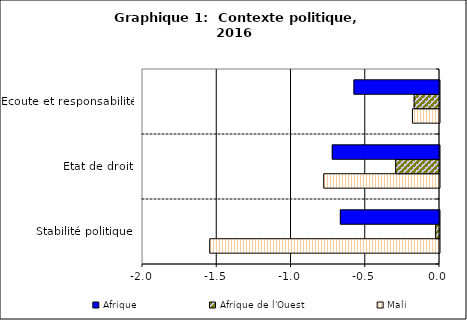
| Category | Mali | Afrique de l'Ouest | Afrique |
|---|---|---|---|
| Stabilité politique | -1.548 | -0.026 | -0.667 |
| Etat de droit | -0.78 | -0.295 | -0.722 |
| Ecoute et responsabilité | -0.182 | -0.171 | -0.576 |